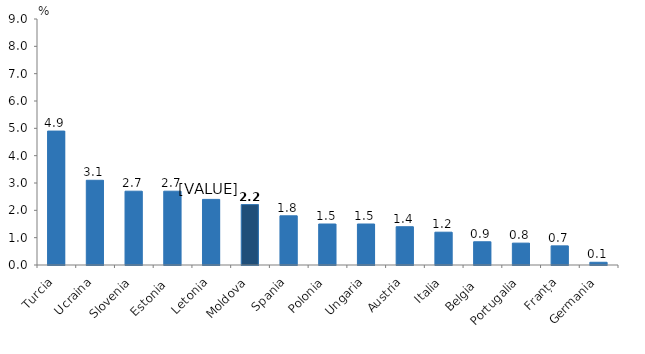
| Category | Rata lunară a inflației, iunie 2022 comparativ cu mai 2022 |
|---|---|
| Turcia | 4.9 |
| Ucraina | 3.1 |
| Slovenia | 2.7 |
| Estonia  | 2.7 |
| Letonia | 2.4 |
| Moldova | 2.21 |
| Spania | 1.8 |
| Polonia | 1.5 |
| Ungaria | 1.5 |
| Austria | 1.4 |
| Italia | 1.2 |
| Belgia  | 0.85 |
| Portugalia | 0.8 |
| Franța | 0.7 |
| Germania | 0.1 |